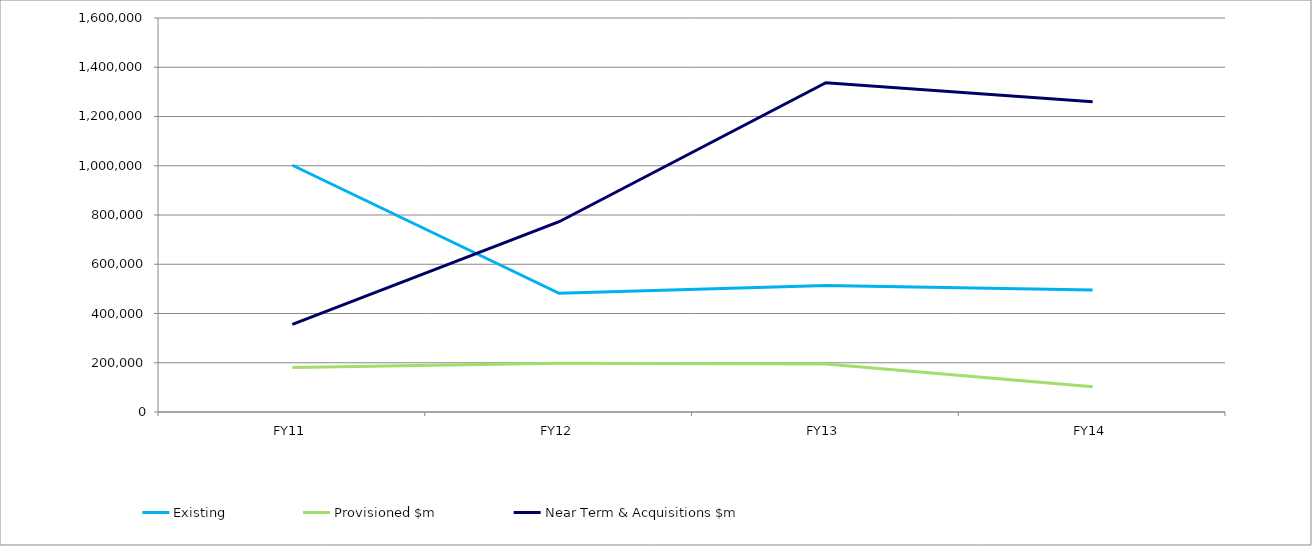
| Category | Existing | Provisioned $m | Near Term & Acquisitions $m |
|---|---|---|---|
| FY11 | 1001976.309 | 180442.875 | 355667.816 |
| FY12 | 481851.471 | 198169.561 | 772760.968 |
| FY13 | 513595.027 | 194572.413 | 1336914.03 |
| FY14 | 495129.672 | 102474.069 | 1259484.281 |